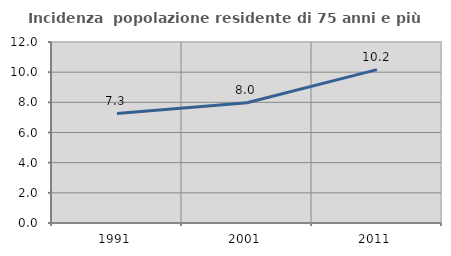
| Category | Incidenza  popolazione residente di 75 anni e più |
|---|---|
| 1991.0 | 7.258 |
| 2001.0 | 7.972 |
| 2011.0 | 10.168 |